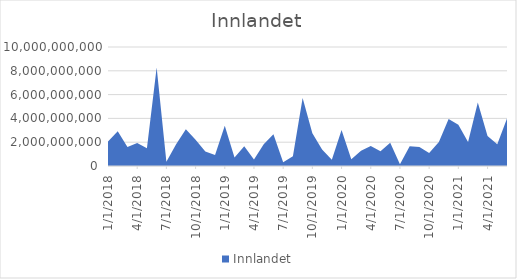
| Category | Innlandet |
|---|---|
| 1/1/18 | 2055050000 |
| 2/1/18 | 2926650000 |
| 3/1/18 | 1592895000 |
| 4/1/18 | 1931580000 |
| 5/1/18 | 1494400000 |
| 6/1/18 | 8277700000 |
| 7/1/18 | 358450000 |
| 8/1/18 | 1829100000 |
| 9/1/18 | 3097300000 |
| 10/1/18 | 2199100000 |
| 11/1/18 | 1213850000 |
| 12/1/18 | 917400000 |
| 1/1/19 | 3391600000 |
| 2/1/19 | 711600000 |
| 3/1/19 | 1654600000 |
| 4/1/19 | 554500000 |
| 5/1/19 | 1827200000 |
| 6/1/19 | 2665130000 |
| 7/1/19 | 310350000 |
| 8/1/19 | 813500000 |
| 9/1/19 | 5711000000 |
| 10/1/19 | 2758000000 |
| 11/1/19 | 1388450000 |
| 12/1/19 | 515000000 |
| 1/1/20 | 3032830000 |
| 2/1/20 | 576050000 |
| 3/1/20 | 1278100000 |
| 4/1/20 | 1681050000 |
| 5/1/20 | 1241350000 |
| 6/1/20 | 1959800000 |
| 7/1/20 | 137100000 |
| 8/1/20 | 1660300000 |
| 9/1/20 | 1604750000 |
| 10/1/20 | 1095550000 |
| 11/1/20 | 2006900000 |
| 12/1/20 | 3939500000 |
| 1/1/21 | 3469530000 |
| 2/1/21 | 2018000000 |
| 3/1/21 | 5337350000 |
| 4/1/21 | 2511450000 |
| 5/1/21 | 1831500000 |
| 6/1/21 | 3993150000 |